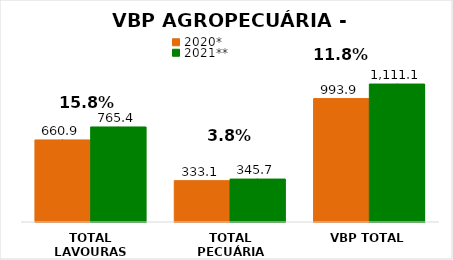
| Category | 2020* | 2021** |
|---|---|---|
| TOTAL LAVOURAS | 660.879 | 765.352 |
| TOTAL PECUÁRIA | 333.051 | 345.736 |
| VBP TOTAL | 993.93 | 1111.088 |